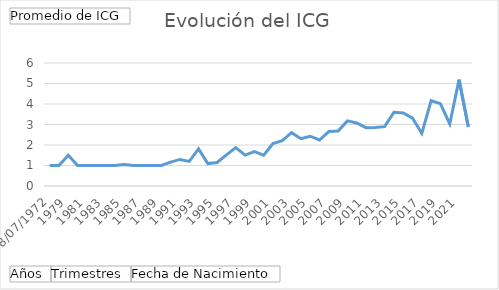
| Category | Total |
|---|---|
| <08/07/1972 | 1 |
| 1972 | 1 |
| 1979 | 1.5 |
| 1980 | 1 |
| 1981 | 1 |
| 1982 | 1 |
| 1983 | 1 |
| 1984 | 1 |
| 1985 | 1.048 |
| 1986 | 1 |
| 1987 | 1 |
| 1988 | 1 |
| 1989 | 1 |
| 1990 | 1.167 |
| 1991 | 1.296 |
| 1992 | 1.2 |
| 1993 | 1.81 |
| 1994 | 1.095 |
| 1995 | 1.148 |
| 1996 | 1.52 |
| 1997 | 1.876 |
| 1998 | 1.51 |
| 1999 | 1.674 |
| 2000 | 1.505 |
| 2001 | 2.074 |
| 2002 | 2.213 |
| 2003 | 2.6 |
| 2004 | 2.305 |
| 2005 | 2.428 |
| 2006 | 2.244 |
| 2007 | 2.656 |
| 2008 | 2.678 |
| 2009 | 3.175 |
| 2010 | 3.077 |
| 2011 | 2.847 |
| 2012 | 2.856 |
| 2013 | 2.894 |
| 2014 | 3.6 |
| 2015 | 3.565 |
| 2016 | 3.307 |
| 2017 | 2.565 |
| 2018 | 4.16 |
| 2019 | 4.019 |
| 2020 | 3.026 |
| 2021 | 5.188 |
| 2022 | 2.878 |